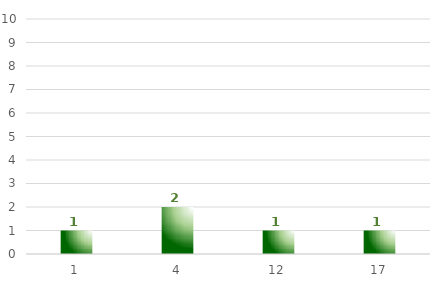
| Category | Metas |
|---|---|
| 1.0 | 1 |
| 4.0 | 2 |
| 12.0 | 1 |
| 17.0 | 1 |